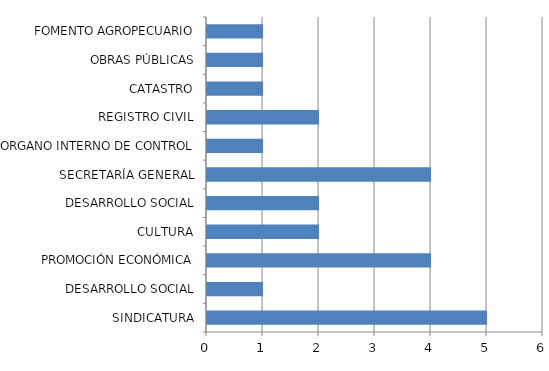
| Category | Series 0 |
|---|---|
| SINDICATURA | 5 |
| DESARROLLO SOCIAL | 1 |
| PROMOCIÓN ECONÓMICA | 4 |
| CULTURA | 2 |
| DESARROLLO SOCIAL | 2 |
| SECRETARÍA GENERAL | 4 |
| ORGANO INTERNO DE CONTROL | 1 |
| REGISTRO CIVIL | 2 |
| CATASTRO | 1 |
| OBRAS PÚBLICAS | 1 |
| FOMENTO AGROPECUARIO | 1 |